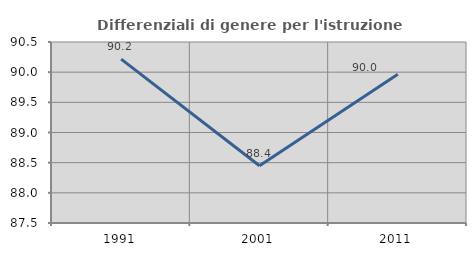
| Category | Differenziali di genere per l'istruzione superiore |
|---|---|
| 1991.0 | 90.216 |
| 2001.0 | 88.45 |
| 2011.0 | 89.967 |